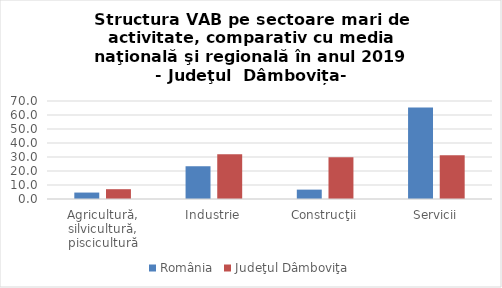
| Category | România | Judeţul Dâmboviţa |
|---|---|---|
| Agricultură, silvicultură, piscicultură | 4.6 | 7 |
| Industrie | 23.4 | 31.9 |
| Construcţii | 6.7 | 29.9 |
| Servicii | 65.3 | 31.2 |